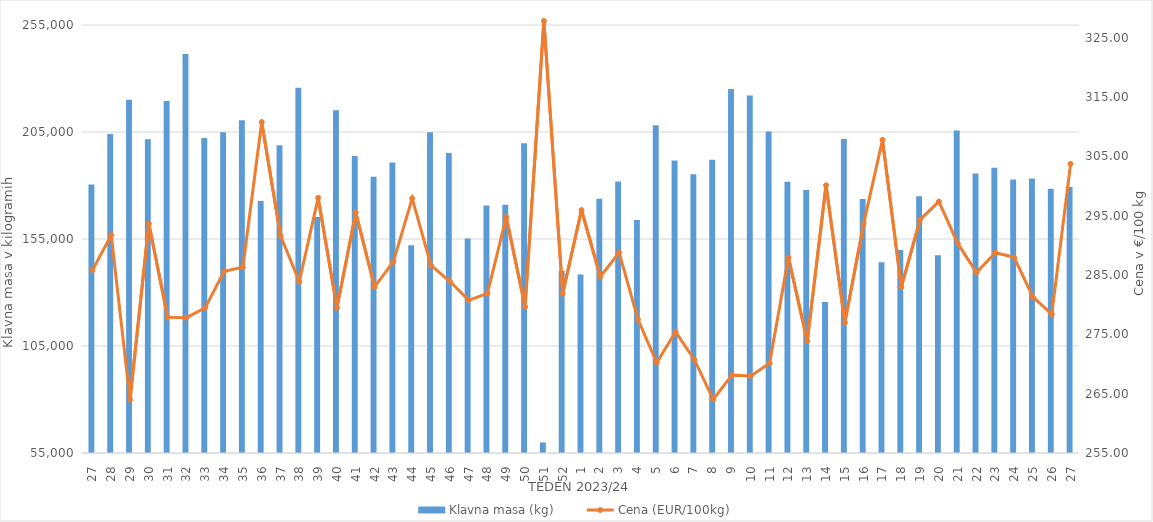
| Category | Klavna masa (kg) |
|---|---|
| 27.0 | 180556 |
| 28.0 | 204078 |
| 29.0 | 220162 |
| 30.0 | 201649 |
| 31.0 | 219538 |
| 32.0 | 241549 |
| 33.0 | 202261 |
| 34.0 | 204903 |
| 35.0 | 210575 |
| 36.0 | 172745 |
| 37.0 | 198877 |
| 38.0 | 225730 |
| 39.0 | 165273 |
| 40.0 | 215175 |
| 41.0 | 193769 |
| 42.0 | 184122 |
| 43.0 | 190834 |
| 44.0 | 152119 |
| 45.0 | 204974 |
| 46.0 | 195179 |
| 47.0 | 155300 |
| 48.0 | 170687 |
| 49.0 | 171040 |
| 50.0 | 199802 |
| 51.0 | 59936 |
| 52.0 | 140361 |
| 1.0 | 138450 |
| 2.0 | 173833 |
| 3.0 | 181907 |
| 4.0 | 163901 |
| 5.0 | 208207 |
| 6.0 | 191770 |
| 7.0 | 185347 |
| 8.0 | 192049 |
| 9.0 | 225097 |
| 10.0 | 222116 |
| 11.0 | 205236 |
| 12.0 | 181756 |
| 13.0 | 177921 |
| 14.0 | 125545 |
| 15.0 | 201765 |
| 16.0 | 173696 |
| 17.0 | 144118 |
| 18.0 | 149874 |
| 19.0 | 174983 |
| 20.0 | 147389 |
| 21.0 | 205795 |
| 22.0 | 185604 |
| 23.0 | 188378 |
| 24.0 | 182824 |
| 25.0 | 183294 |
| 26.0 | 178550 |
| 27.0 | 179283 |